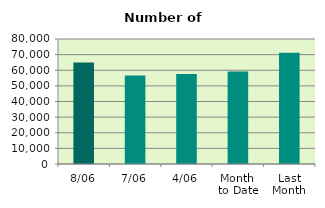
| Category | Series 0 |
|---|---|
| 8/06 | 64918 |
| 7/06 | 56658 |
| 4/06 | 57564 |
| Month 
to Date | 59180 |
| Last
Month | 71249.7 |